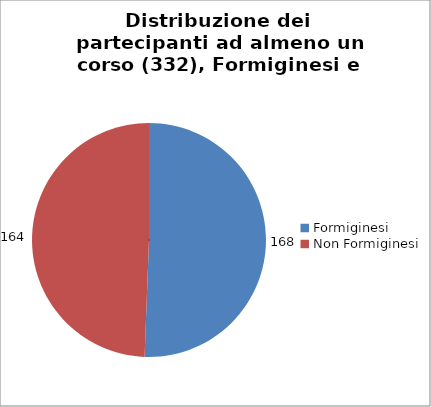
| Category | Nr. Tesserati |
|---|---|
| Formiginesi | 168 |
| Non Formiginesi | 164 |